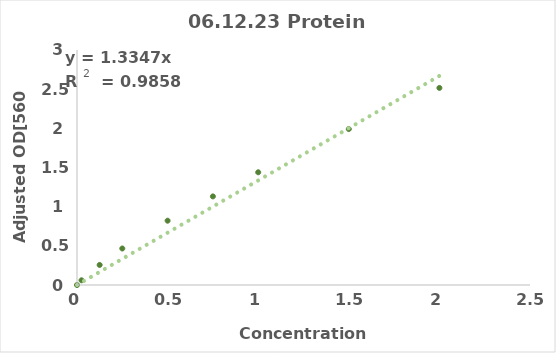
| Category | Series 0 |
|---|---|
| 0.0 | 0 |
| 0.025 | 0.06 |
| 0.125 | 0.256 |
| 0.25 | 0.466 |
| 0.5 | 0.821 |
| 0.75 | 1.131 |
| 1.0 | 1.439 |
| 1.5 | 1.991 |
| 2.0 | 2.516 |